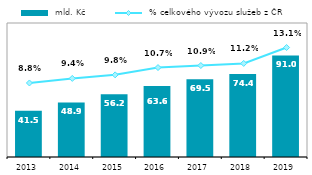
| Category |  mld. Kč |
|---|---|
| 2013.0 | 41.49 |
| 2014.0 | 48.891 |
| 2015.0 | 56.164 |
| 2016.0 | 63.584 |
| 2017.0 | 69.518 |
| 2018.0 | 74.364 |
| 2019.0 | 91 |